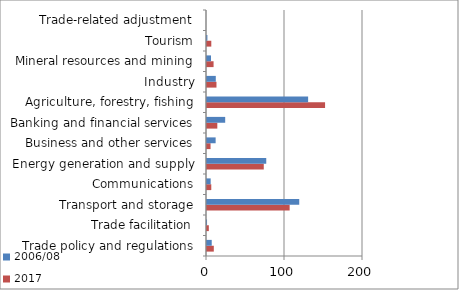
| Category | 2017 | 2006/08 |
|---|---|---|
| Trade policy and regulations | 8.722 | 6.06 |
| Trade facilitation | 2.346 | 0.058 |
| Transport and storage | 105.955 | 118.258 |
| Communications | 5.49 | 4.715 |
| Energy generation and supply | 72.788 | 75.964 |
| Business and other services | 4.55 | 11.073 |
| Banking and financial services | 13.218 | 23.326 |
| Agriculture, forestry, fishing | 151.373 | 129.643 |
| Industry | 12.146 | 11.269 |
| Mineral resources and mining | 8.423 | 5.094 |
| Tourism | 5.507 | 0.523 |
| Trade-related adjustment | 0 | 0 |